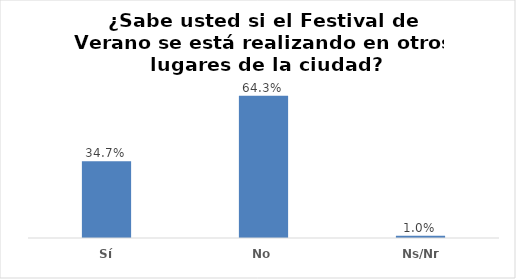
| Category | Series 0 |
|---|---|
| Sí | 0.347 |
| No | 0.643 |
| Ns/Nr | 0.01 |